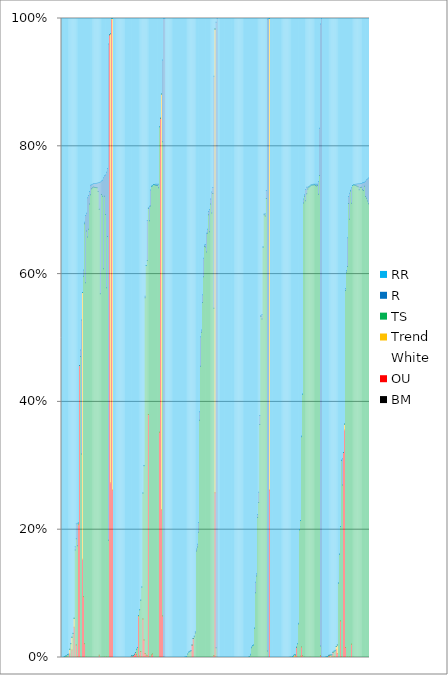
| Category | BM | OU | White | Trend | TS | R | RR |
|---|---|---|---|---|---|---|---|
| 0 | 0 | 0 | 0 | 0 | 0 | 0 | 1 |
| 1 | 0 | 0 | 0 | 0 | 0 | 0 | 1 |
| 2 | 0 | 0 | 0 | 0 | 0 | 0 | 1 |
| 3 | 0 | 0.001 | 0 | 0 | 0.001 | 0 | 0.998 |
| 4 | 0 | 0.001 | 0 | 0 | 0.001 | 0 | 0.998 |
| 5 | 0 | 0.001 | 0 | 0 | 0.002 | 0 | 0.997 |
| 6 | 0 | 0 | 0 | 0 | 0.004 | 0 | 0.995 |
| 7 | 0 | 0 | 0 | 0 | 0.004 | 0.001 | 0.995 |
| 8 | 0 | 0.005 | 0 | 0.007 | 0 | 0 | 0.987 |
| 9 | 0 | 0 | 0 | 0 | 0.022 | 0 | 0.978 |
| 10 | 0 | 0.012 | 0 | 0.02 | 0 | 0 | 0.968 |
| 11 | 0 | 0 | 0 | 0 | 0.037 | 0 | 0.962 |
| 12 | 0 | 0.047 | 0 | 0.014 | 0 | 0 | 0.939 |
| 13 | 0 | 0 | 0 | 0 | 0.168 | 0.005 | 0.827 |
| 14 | 0 | 0.02 | 0 | 0 | 0.166 | 0.023 | 0.791 |
| 15 | 0 | 0.001 | 0 | 0 | 0.174 | 0.035 | 0.79 |
| 16 | 0 | 0.207 | 0 | 0.001 | 0.003 | 0 | 0.79 |
| 17 | 0 | 0.457 | 0 | 0 | 0 | 0 | 0.543 |
| 18 | 0 | 0 | 0 | 0 | 0.471 | 0.01 | 0.519 |
| 19 | 0 | 0 | 0 | 0 | 0.318 | 0.21 | 0.472 |
| 20 | 0 | 0.154 | 0 | 0.417 | 0 | 0 | 0.429 |
| 21 | 0 | 0.095 | 0 | 0 | 0.502 | 0.01 | 0.394 |
| 22 | 0 | 0.022 | 0 | 0 | 0.657 | 0.002 | 0.319 |
| 23 | 0 | 0 | 0 | 0 | 0.586 | 0.105 | 0.308 |
| 24 | 0 | 0 | 0 | 0 | 0.667 | 0.028 | 0.305 |
| 25 | 0 | 0 | 0 | 0 | 0.658 | 0.061 | 0.281 |
| 26 | 0 | 0 | 0 | 0 | 0.67 | 0.053 | 0.277 |
| 27 | 0 | 0 | 0 | 0 | 0.709 | 0.02 | 0.271 |
| 28 | 0 | 0 | 0 | 0 | 0.724 | 0.015 | 0.261 |
| 29 | 0 | 0 | 0 | 0 | 0.734 | 0.006 | 0.26 |
| 30 | 0 | 0 | 0 | 0 | 0.735 | 0.005 | 0.26 |
| 31 | 0 | 0 | 0 | 0 | 0.736 | 0.005 | 0.258 |
| 32 | 0 | 0 | 0 | 0 | 0.736 | 0.006 | 0.258 |
| 33 | 0 | 0 | 0 | 0 | 0.735 | 0.007 | 0.258 |
| 34 | 0 | 0 | 0 | 0 | 0.735 | 0.007 | 0.258 |
| 35 | 0 | 0 | 0 | 0 | 0.729 | 0.014 | 0.257 |
| 36 | 0 | 0.003 | 0 | 0 | 0.698 | 0.042 | 0.257 |
| 37 | 0 | 0 | 0 | 0 | 0.569 | 0.175 | 0.256 |
| 38 | 0 | 0 | 0 | 0 | 0.725 | 0.021 | 0.254 |
| 39 | 0 | 0 | 0 | 0 | 0.722 | 0.025 | 0.253 |
| 40 | 0 | 0 | 0 | 0 | 0.608 | 0.142 | 0.249 |
| 41 | 0 | 0 | 0 | 0 | 0.721 | 0.032 | 0.246 |
| 42 | 0 | 0 | 0 | 0 | 0.693 | 0.062 | 0.245 |
| 43 | 0 | 0.001 | 0 | 0 | 0.578 | 0.181 | 0.241 |
| 44 | 0 | 0 | 0 | 0 | 0.659 | 0.107 | 0.235 |
| 45 | 0 | 0 | 0 | 0 | 0.184 | 0.777 | 0.04 |
| 46 | 0 | 0.975 | 0 | 0 | 0 | 0 | 0.025 |
| 47 | 0 | 0.274 | 0 | 0.703 | 0 | 0 | 0.024 |
| 48 | 0 | 0.999 | 0 | 0.001 | 0 | 0 | 0 |
| 49 | 0 | 0.262 | 0 | 0.738 | 0 | 0 | 0 |
| 50 | 0 | 0 | 0 | 0 | 0 | 0 | 1 |
| 51 | 0 | 0 | 0 | 0 | 0 | 0 | 1 |
| 52 | 0 | 0 | 0 | 0 | 0 | 0 | 1 |
| 53 | 0 | 0 | 0 | 0 | 0 | 0 | 1 |
| 54 | 0 | 0 | 0 | 0 | 0 | 0 | 1 |
| 55 | 0 | 0 | 0 | 0 | 0 | 0 | 1 |
| 56 | 0 | 0 | 0 | 0 | 0 | 0 | 1 |
| 57 | 0 | 0 | 0 | 0 | 0 | 0 | 1 |
| 58 | 0 | 0 | 0 | 0 | 0 | 0 | 1 |
| 59 | 0 | 0 | 0 | 0 | 0 | 0 | 1 |
| 60 | 0 | 0 | 0 | 0 | 0 | 0 | 1 |
| 61 | 0 | 0 | 0 | 0 | 0 | 0 | 1 |
| 62 | 0 | 0 | 0 | 0 | 0 | 0 | 1 |
| 63 | 0 | 0 | 0 | 0 | 0 | 0 | 1 |
| 64 | 0 | 0 | 0 | 0 | 0 | 0 | 1 |
| 65 | 0 | 0 | 0 | 0 | 0 | 0 | 1 |
| 66 | 0 | 0 | 0 | 0 | 0.001 | 0 | 0.999 |
| 67 | 0 | 0.003 | 0 | 0 | 0 | 0 | 0.997 |
| 68 | 0 | 0 | 0 | 0 | 0.002 | 0 | 0.997 |
| 69 | 0 | 0.003 | 0 | 0 | 0 | 0 | 0.997 |
| 70 | 0 | 0.005 | 0 | 0 | 0 | 0 | 0.995 |
| 71 | 0 | 0.008 | 0 | 0 | 0 | 0 | 0.992 |
| 72 | 0 | 0.004 | 0 | 0 | 0.008 | 0 | 0.987 |
| 73 | 0 | 0 | 0 | 0 | 0.015 | 0 | 0.984 |
| 74 | 0 | 0.064 | 0 | 0.001 | 0.001 | 0 | 0.934 |
| 75 | 0 | 0.002 | 0 | 0 | 0.073 | 0 | 0.925 |
| 76 | 0 | 0.009 | 0 | 0 | 0.08 | 0 | 0.91 |
| 77 | 0 | 0.001 | 0 | 0 | 0.109 | 0 | 0.89 |
| 78 | 0 | 0.06 | 0 | 0 | 0.197 | 0 | 0.742 |
| 79 | 0 | 0.028 | 0 | 0 | 0.273 | 0 | 0.7 |
| 80 | 0 | 0.006 | 0 | 0 | 0.557 | 0.002 | 0.435 |
| 81 | 0 | 0.003 | 0 | 0 | 0.61 | 0 | 0.386 |
| 82 | 0 | 0.003 | 0 | 0 | 0.619 | 0.063 | 0.316 |
| 83 | 0 | 0.38 | 0 | 0 | 0.323 | 0.001 | 0.296 |
| 84 | 0 | 0.001 | 0 | 0 | 0.683 | 0.023 | 0.294 |
| 85 | 0 | 0 | 0 | 0 | 0.706 | 0.025 | 0.269 |
| 86 | 0 | 0.004 | 0 | 0 | 0.733 | 0 | 0.262 |
| 87 | 0 | 0.005 | 0 | 0 | 0.733 | 0 | 0.262 |
| 88 | 0 | 0 | 0 | 0 | 0.74 | 0 | 0.26 |
| 89 | 0 | 0 | 0 | 0 | 0.74 | 0 | 0.26 |
| 90 | 0 | 0 | 0 | 0 | 0.739 | 0.001 | 0.26 |
| 91 | 0 | 0 | 0 | 0 | 0.738 | 0.002 | 0.259 |
| 92 | 0 | 0 | 0 | 0 | 0.739 | 0.002 | 0.259 |
| 93 | 0 | 0 | 0 | 0 | 0.735 | 0.005 | 0.259 |
| 94 | 0 | 0.352 | 0 | 0 | 0.478 | 0 | 0.169 |
| 95 | 0 | 0.844 | 0 | 0 | 0 | 0 | 0.156 |
| 96 | 0 | 0.231 | 0 | 0.651 | 0 | 0 | 0.118 |
| 97 | 0 | 0.051 | 0 | 0 | 0.589 | 0.102 | 0.052 |
| 98 | 0 | 0 | 0 | 0 | 0 | 1 | 0 |
| 99 | 0 | 0 | 0 | 0 | 0 | 1 | 0 |
| 100 | 0 | 0 | 0 | 0 | 0 | 0 | 1 |
| 101 | 0 | 0 | 0 | 0 | 0 | 0 | 1 |
| 102 | 0 | 0 | 0 | 0 | 0 | 0 | 1 |
| 103 | 0 | 0 | 0 | 0 | 0 | 0 | 1 |
| 104 | 0 | 0 | 0 | 0 | 0 | 0 | 1 |
| 105 | 0 | 0 | 0 | 0 | 0 | 0 | 1 |
| 106 | 0 | 0 | 0 | 0 | 0 | 0 | 1 |
| 107 | 0 | 0 | 0 | 0 | 0 | 0 | 1 |
| 108 | 0 | 0 | 0 | 0 | 0 | 0 | 1 |
| 109 | 0 | 0 | 0 | 0 | 0 | 0 | 1 |
| 110 | 0 | 0 | 0 | 0 | 0 | 0 | 1 |
| 111 | 0 | 0 | 0 | 0 | 0 | 0 | 1 |
| 112 | 0 | 0 | 0 | 0 | 0 | 0 | 1 |
| 113 | 0 | 0 | 0 | 0 | 0 | 0 | 1 |
| 114 | 0 | 0 | 0 | 0 | 0 | 0 | 1 |
| 115 | 0 | 0 | 0 | 0 | 0 | 0 | 1 |
| 116 | 0 | 0 | 0 | 0 | 0 | 0 | 1 |
| 117 | 0 | 0 | 0 | 0 | 0 | 0 | 1 |
| 118 | 0 | 0 | 0 | 0 | 0 | 0 | 1 |
| 119 | 0 | 0 | 0 | 0 | 0.001 | 0 | 0.999 |
| 120 | 0 | 0 | 0 | 0 | 0.001 | 0 | 0.998 |
| 121 | 0 | 0 | 0 | 0 | 0.005 | 0 | 0.995 |
| 122 | 0 | 0 | 0 | 0 | 0.008 | 0 | 0.992 |
| 123 | 0 | 0 | 0 | 0 | 0.009 | 0 | 0.99 |
| 124 | 0 | 0 | 0 | 0 | 0.01 | 0.001 | 0.989 |
| 125 | 0 | 0.019 | 0 | 0 | 0 | 0 | 0.981 |
| 126 | 0 | 0.03 | 0 | 0 | 0 | 0 | 0.97 |
| 127 | 0 | 0 | 0 | 0 | 0.032 | 0.001 | 0.966 |
| 128 | 0 | 0 | 0 | 0 | 0.038 | 0.002 | 0.96 |
| 129 | 0 | 0 | 0 | 0 | 0.166 | 0.003 | 0.83 |
| 130 | 0 | 0 | 0 | 0 | 0.173 | 0.004 | 0.823 |
| 131 | 0 | 0 | 0 | 0 | 0.196 | 0.015 | 0.789 |
| 132 | 0 | 0 | 0 | 0 | 0.371 | 0.014 | 0.615 |
| 133 | 0 | 0 | 0 | 0 | 0.456 | 0.046 | 0.498 |
| 134 | 0 | 0 | 0 | 0 | 0.509 | 0.003 | 0.488 |
| 135 | 0 | 0 | 0 | 0 | 0.556 | 0.012 | 0.432 |
| 136 | 0 | 0 | 0 | 0 | 0.596 | 0.029 | 0.375 |
| 137 | 0 | 0 | 0 | 0 | 0.643 | 0.002 | 0.355 |
| 138 | 0 | 0 | 0 | 0 | 0.643 | 0.004 | 0.354 |
| 139 | 0 | 0 | 0 | 0 | 0.635 | 0.029 | 0.336 |
| 140 | 0 | 0 | 0 | 0 | 0.664 | 0.006 | 0.33 |
| 141 | 0 | 0 | 0 | 0 | 0.693 | 0.005 | 0.302 |
| 142 | 0 | 0 | 0 | 0 | 0.666 | 0.035 | 0.299 |
| 143 | 0 | 0 | 0 | 0 | 0.71 | 0.008 | 0.283 |
| 144 | 0 | 0 | 0 | 0 | 0.695 | 0.033 | 0.272 |
| 145 | 0 | 0 | 0 | 0 | 0.726 | 0.009 | 0.264 |
| 146 | 0 | 0.003 | 0 | 0 | 0.545 | 0.364 | 0.091 |
| 147 | 0 | 0.258 | 0 | 0.726 | 0 | 0 | 0.016 |
| 148 | 0 | 0 | 0 | 0 | 0.015 | 0.979 | 0.006 |
| 149 | 0 | 0 | 0 | 0 | 0 | 1 | 0 |
| 150 | 0 | 0 | 0 | 0 | 0 | 0 | 1 |
| 151 | 0 | 0 | 0 | 0 | 0 | 0 | 1 |
| 152 | 0 | 0 | 0 | 0 | 0 | 0 | 1 |
| 153 | 0 | 0 | 0 | 0 | 0 | 0 | 1 |
| 154 | 0 | 0 | 0 | 0 | 0 | 0 | 1 |
| 155 | 0 | 0 | 0 | 0 | 0 | 0 | 1 |
| 156 | 0 | 0 | 0 | 0 | 0 | 0 | 1 |
| 157 | 0 | 0 | 0 | 0 | 0 | 0 | 1 |
| 158 | 0 | 0 | 0 | 0 | 0 | 0 | 1 |
| 159 | 0 | 0 | 0 | 0 | 0 | 0 | 1 |
| 160 | 0 | 0 | 0 | 0 | 0 | 0 | 1 |
| 161 | 0 | 0 | 0 | 0 | 0 | 0 | 1 |
| 162 | 0 | 0 | 0 | 0 | 0 | 0 | 1 |
| 163 | 0 | 0 | 0 | 0 | 0 | 0 | 1 |
| 164 | 0 | 0 | 0 | 0 | 0 | 0 | 1 |
| 165 | 0 | 0 | 0 | 0 | 0 | 0 | 1 |
| 166 | 0 | 0 | 0 | 0 | 0 | 0 | 1 |
| 167 | 0 | 0 | 0 | 0 | 0 | 0 | 1 |
| 168 | 0 | 0 | 0 | 0 | 0 | 0 | 1 |
| 169 | 0 | 0 | 0 | 0 | 0 | 0 | 1 |
| 170 | 0 | 0 | 0 | 0 | 0 | 0 | 1 |
| 171 | 0 | 0 | 0 | 0 | 0 | 0 | 1 |
| 172 | 0 | 0 | 0 | 0 | 0 | 0 | 1 |
| 173 | 0 | 0 | 0 | 0 | 0 | 0 | 1 |
| 174 | 0 | 0 | 0 | 0 | 0 | 0 | 1 |
| 175 | 0 | 0 | 0 | 0 | 0 | 0 | 1 |
| 176 | 0 | 0 | 0 | 0 | 0 | 0 | 1 |
| 177 | 0 | 0 | 0 | 0 | 0 | 0 | 1 |
| 178 | 0 | 0 | 0 | 0 | 0 | 0 | 1 |
| 179 | 0 | 0.001 | 0 | 0 | 0 | 0 | 0.999 |
| 180 | 0 | 0 | 0 | 0.001 | 0 | 0 | 0.999 |
| 181 | 0 | 0 | 0 | 0 | 0.004 | 0.001 | 0.995 |
| 182 | 0 | 0 | 0 | 0 | 0.015 | 0.001 | 0.984 |
| 183 | 0 | 0 | 0 | 0 | 0.018 | 0 | 0.981 |
| 184 | 0 | 0 | 0 | 0 | 0.019 | 0 | 0.98 |
| 185 | 0 | 0 | 0 | 0 | 0.046 | 0 | 0.954 |
| 186 | 0 | 0 | 0 | 0 | 0.102 | 0.016 | 0.882 |
| 187 | 0 | 0 | 0 | 0 | 0.128 | 0.003 | 0.869 |
| 188 | 0 | 0 | 0 | 0 | 0.219 | 0.004 | 0.776 |
| 189 | 0 | 0 | 0 | 0 | 0.243 | 0.016 | 0.741 |
| 190 | 0 | 0 | 0 | 0 | 0.365 | 0.014 | 0.621 |
| 191 | 0 | 0 | 0 | 0 | 0.534 | 0.001 | 0.465 |
| 192 | 0 | 0 | 0 | 0 | 0.53 | 0.007 | 0.463 |
| 193 | 0 | 0 | 0 | 0 | 0.642 | 0.001 | 0.357 |
| 194 | 0 | 0 | 0 | 0 | 0.693 | 0.001 | 0.306 |
| 195 | 0 | 0 | 0 | 0 | 0.691 | 0.004 | 0.306 |
| 196 | 0 | 0 | 0 | 0 | 0.718 | 0.013 | 0.269 |
| 197 | 0 | 0 | 0 | 0 | 0.01 | 0.989 | 0.001 |
| 198 | 0 | 0 | 0 | 0 | 0 | 1 | 0 |
| 199 | 0 | 0.262 | 0 | 0.738 | 0 | 0 | 0 |
| 200 | 0 | 0 | 0 | 0 | 0 | 0 | 1 |
| 201 | 0 | 0 | 0 | 0 | 0 | 0 | 1 |
| 202 | 0 | 0 | 0 | 0 | 0 | 0 | 1 |
| 203 | 0 | 0 | 0 | 0 | 0 | 0 | 1 |
| 204 | 0 | 0 | 0 | 0 | 0 | 0 | 1 |
| 205 | 0 | 0 | 0 | 0 | 0 | 0 | 1 |
| 206 | 0 | 0 | 0 | 0 | 0 | 0 | 1 |
| 207 | 0 | 0 | 0 | 0 | 0 | 0 | 1 |
| 208 | 0 | 0 | 0 | 0 | 0 | 0 | 1 |
| 209 | 0 | 0 | 0 | 0 | 0 | 0 | 1 |
| 210 | 0 | 0 | 0 | 0 | 0 | 0 | 1 |
| 211 | 0 | 0 | 0 | 0 | 0 | 0 | 1 |
| 212 | 0 | 0 | 0 | 0 | 0 | 0 | 1 |
| 213 | 0 | 0 | 0 | 0 | 0 | 0 | 1 |
| 214 | 0 | 0 | 0 | 0 | 0 | 0 | 1 |
| 215 | 0 | 0 | 0 | 0 | 0 | 0 | 1 |
| 216 | 0 | 0 | 0 | 0 | 0 | 0 | 1 |
| 217 | 0 | 0 | 0 | 0 | 0 | 0 | 1 |
| 218 | 0 | 0 | 0 | 0 | 0 | 0 | 1 |
| 219 | 0 | 0 | 0 | 0 | 0 | 0 | 1 |
| 220 | 0 | 0 | 0 | 0 | 0 | 0 | 1 |
| 221 | 0 | 0 | 0 | 0 | 0.002 | 0 | 0.998 |
| 222 | 0 | 0 | 0 | 0 | 0.003 | 0.001 | 0.997 |
| 223 | 0 | 0.001 | 0 | 0.003 | 0 | 0 | 0.996 |
| 224 | 0 | 0.002 | 0 | 0 | 0.002 | 0 | 0.996 |
| 225 | 0 | 0.016 | 0 | 0 | 0 | 0 | 0.984 |
| 226 | 0 | 0 | 0 | 0 | 0.021 | 0 | 0.978 |
| 227 | 0 | 0 | 0 | 0 | 0.052 | 0.001 | 0.947 |
| 228 | 0 | 0 | 0 | 0 | 0.2 | 0 | 0.8 |
| 229 | 0 | 0.002 | 0 | 0 | 0.212 | 0 | 0.786 |
| 230 | 0 | 0.016 | 0 | 0 | 0.329 | 0.001 | 0.654 |
| 231 | 0 | 0.003 | 0 | 0 | 0.409 | 0 | 0.588 |
| 232 | 0 | 0 | 0 | 0 | 0.711 | 0.006 | 0.282 |
| 233 | 0 | 0 | 0 | 0 | 0.721 | 0.002 | 0.276 |
| 234 | 0 | 0 | 0 | 0 | 0.715 | 0.018 | 0.268 |
| 235 | 0 | 0 | 0 | 0 | 0.726 | 0.01 | 0.264 |
| 236 | 0 | 0 | 0 | 0 | 0.733 | 0.003 | 0.264 |
| 237 | 0 | 0 | 0 | 0 | 0.736 | 0.001 | 0.263 |
| 238 | 0 | 0 | 0 | 0 | 0.737 | 0 | 0.262 |
| 239 | 0 | 0 | 0 | 0 | 0.739 | 0.001 | 0.26 |
| 240 | 0 | 0 | 0 | 0 | 0.74 | 0 | 0.26 |
| 241 | 0 | 0 | 0 | 0 | 0.74 | 0.001 | 0.26 |
| 242 | 0 | 0 | 0 | 0 | 0.74 | 0.001 | 0.26 |
| 243 | 0 | 0 | 0 | 0 | 0.739 | 0.002 | 0.259 |
| 244 | 0 | 0 | 0 | 0 | 0.738 | 0.003 | 0.259 |
| 245 | 0 | 0 | 0 | 0 | 0.739 | 0.002 | 0.259 |
| 246 | 0 | 0 | 0 | 0 | 0.725 | 0.02 | 0.255 |
| 247 | 0 | 0 | 0 | 0 | 0.754 | 0.074 | 0.172 |
| 248 | 0 | 0.003 | 0 | 0 | 0.015 | 0.977 | 0.009 |
| 249 | 0 | 0 | 0 | 0 | 0 | 1 | 0 |
| 250 | 0 | 0 | 0 | 0 | 0 | 0 | 1 |
| 251 | 0 | 0 | 0 | 0 | 0 | 0 | 1 |
| 252 | 0 | 0 | 0 | 0 | 0 | 0 | 1 |
| 253 | 0 | 0 | 0 | 0 | 0 | 0 | 1 |
| 254 | 0 | 0 | 0 | 0 | 0.001 | 0 | 0.999 |
| 255 | 0 | 0.001 | 0 | 0 | 0.001 | 0 | 0.999 |
| 256 | 0 | 0.002 | 0 | 0 | 0.001 | 0 | 0.997 |
| 257 | 0 | 0.003 | 0 | 0 | 0 | 0 | 0.997 |
| 258 | 0 | 0.001 | 0 | 0.003 | 0 | 0 | 0.996 |
| 259 | 0 | 0 | 0 | 0 | 0.004 | 0 | 0.996 |
| 260 | 0 | 0.008 | 0 | 0 | 0.001 | 0 | 0.992 |
| 261 | 0 | 0.002 | 0 | 0 | 0.008 | 0 | 0.99 |
| 262 | 0 | 0 | 0 | 0 | 0.01 | 0 | 0.989 |
| 263 | 0 | 0.012 | 0 | 0.005 | 0 | 0 | 0.983 |
| 264 | 0 | 0.006 | 0 | 0.013 | 0 | 0 | 0.98 |
| 265 | 0 | 0 | 0 | 0 | 0.116 | 0.001 | 0.883 |
| 266 | 0 | 0 | 0 | 0 | 0.161 | 0 | 0.838 |
| 267 | 0 | 0.057 | 0 | 0 | 0.148 | 0 | 0.795 |
| 268 | 0 | 0.001 | 0 | 0 | 0.307 | 0.001 | 0.691 |
| 269 | 0 | 0 | 0 | 0 | 0.27 | 0.041 | 0.689 |
| 270 | 0 | 0.321 | 0 | 0 | 0 | 0 | 0.679 |
| 271 | 0 | 0.356 | 0 | 0.009 | 0 | 0 | 0.635 |
| 272 | 0 | 0.015 | 0 | 0 | 0.559 | 0.003 | 0.423 |
| 273 | 0 | 0 | 0 | 0 | 0.603 | 0.003 | 0.395 |
| 274 | 0 | 0.001 | 0 | 0 | 0.611 | 0.045 | 0.343 |
| 275 | 0 | 0 | 0 | 0 | 0.71 | 0.011 | 0.278 |
| 276 | 0 | 0.001 | 0 | 0 | 0.685 | 0.04 | 0.274 |
| 277 | 0 | 0 | 0 | 0 | 0.73 | 0.001 | 0.269 |
| 278 | 0 | 0.021 | 0 | 0 | 0.69 | 0.024 | 0.265 |
| 279 | 0 | 0 | 0 | 0 | 0.739 | 0 | 0.261 |
| 280 | 0 | 0 | 0 | 0 | 0.739 | 0 | 0.26 |
| 281 | 0 | 0 | 0 | 0 | 0.739 | 0.001 | 0.26 |
| 282 | 0 | 0 | 0 | 0 | 0.739 | 0.002 | 0.259 |
| 283 | 0 | 0 | 0 | 0 | 0.737 | 0.004 | 0.259 |
| 284 | 0 | 0 | 0 | 0 | 0.737 | 0.005 | 0.259 |
| 285 | 0 | 0 | 0 | 0 | 0.732 | 0.009 | 0.258 |
| 286 | 0 | 0 | 0 | 0 | 0.736 | 0.006 | 0.258 |
| 287 | 0 | 0 | 0 | 0 | 0.736 | 0.006 | 0.258 |
| 288 | 0 | 0 | 0 | 0 | 0.732 | 0.011 | 0.257 |
| 289 | 0 | 0 | 0 | 0 | 0.731 | 0.012 | 0.257 |
| 290 | 0 | 0 | 0 | 0 | 0.737 | 0.006 | 0.256 |
| 291 | 0 | 0 | 0 | 0 | 0.722 | 0.024 | 0.255 |
| 292 | 0 | 0 | 0 | 0 | 0.719 | 0.029 | 0.252 |
| 293 | 0 | 0 | 0 | 0 | 0.714 | 0.035 | 0.251 |
| 294 | 0 | 0 | 0 | 0 | 0.71 | 0.04 | 0.25 |